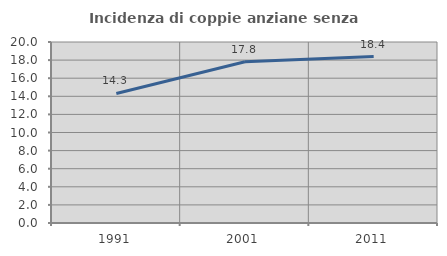
| Category | Incidenza di coppie anziane senza figli  |
|---|---|
| 1991.0 | 14.314 |
| 2001.0 | 17.824 |
| 2011.0 | 18.384 |